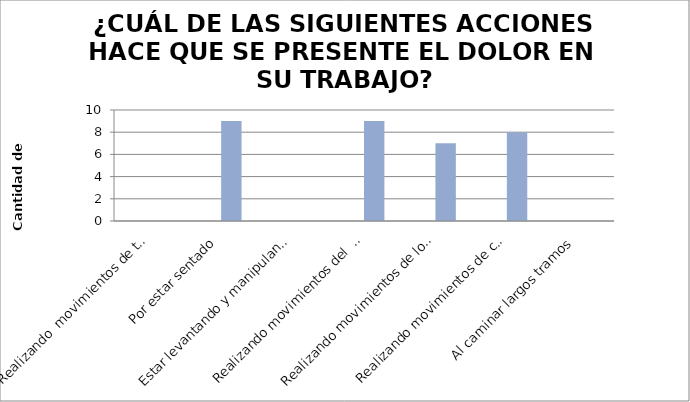
| Category | Series 0 | Series 1 |
|---|---|---|
| Realizando  movimientos de tronco |  | 0 |
| Por estar sentado |  | 9 |
| Estar levantando y manipulando cargas |  | 0 |
| Realizando movimientos del  cuello |  | 9 |
| Realizando movimientos de los dedos/mano/muñeca |  | 7 |
| Realizando movimientos de codo o el hombro. |  | 8 |
| Al caminar largos tramos |  | 0 |